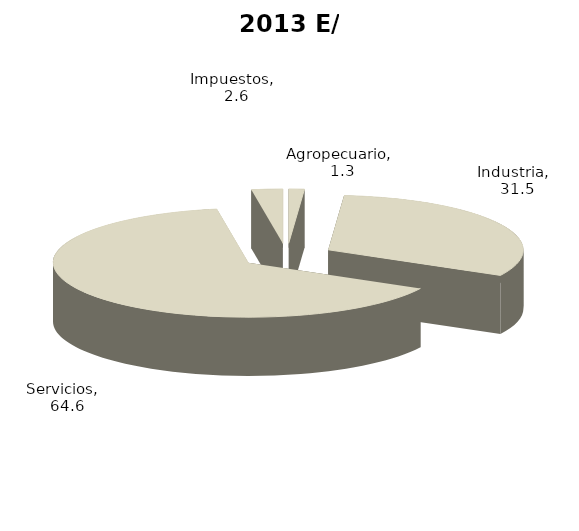
| Category | 2013 E/ |
|---|---|
| Agropecuario | 1.293 |
| Industria | 31.514 |
| Servicios | 64.61 |
| Impuestos | 2.583 |